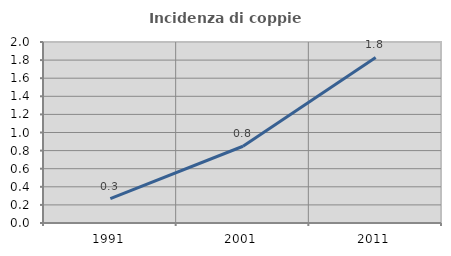
| Category | Incidenza di coppie miste |
|---|---|
| 1991.0 | 0.269 |
| 2001.0 | 0.848 |
| 2011.0 | 1.829 |